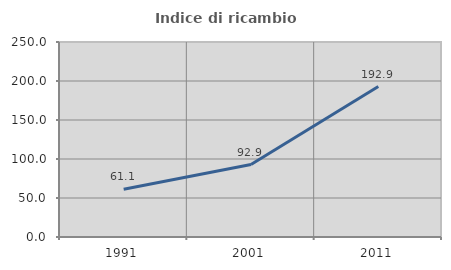
| Category | Indice di ricambio occupazionale  |
|---|---|
| 1991.0 | 61.127 |
| 2001.0 | 92.906 |
| 2011.0 | 192.875 |